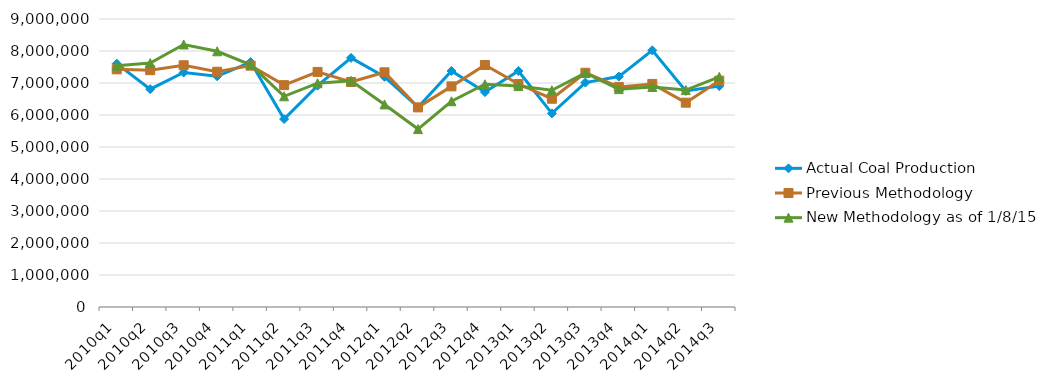
| Category | Actual Coal Production | Previous Methodology | New Methodology as of 1/8/15 |
|---|---|---|---|
| 2010q1 | 7604800 | 7426375 | 7541655 |
| 2010q2 | 6806636 | 7400865 | 7622866 |
| 2010q3 | 7327729 | 7554347 | 8203819 |
| 2010q4 | 7209779 | 7352078 | 7990926 |
| 2011q1 | 7654276 | 7542274 | 7568524 |
| 2011q2 | 5872831 | 6932800 | 6584733 |
| 2011q3 | 6918333 | 7346191 | 6993022 |
| 2011q4 | 7785979 | 7031217 | 7069149 |
| 2012q1 | 7194042 | 7334079 | 6330665 |
| 2012q2 | 6242389 | 6238151 | 5559940 |
| 2012q3 | 7376032 | 6894686 | 6430036 |
| 2012q4 | 6716203 | 7562026 | 6960362 |
| 2013q1 | 7374364 | 6968600 | 6904746 |
| 2013q2 | 6050897 | 6508201 | 6774353 |
| 2013q3 | 7012832 | 7319547 | 7315636 |
| 2013q4 | 7200967 | 6876324 | 6809030 |
| 2014q1 | 8020711 | 6970869 | 6876392 |
| 2014q2 | 6751790 | 6385053 | 6780086 |
| 2014q3 | 6903531 | 7073310 | 7193162 |